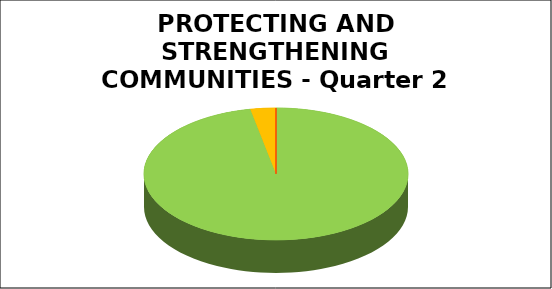
| Category | Series 0 |
|---|---|
| Green | 0.969 |
| Amber | 0.031 |
| Red | 0 |